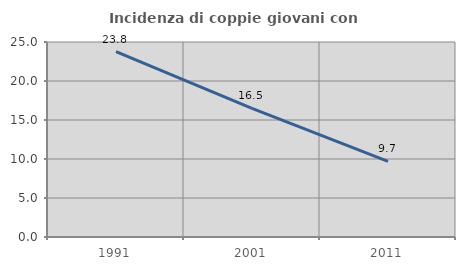
| Category | Incidenza di coppie giovani con figli |
|---|---|
| 1991.0 | 23.759 |
| 2001.0 | 16.493 |
| 2011.0 | 9.693 |